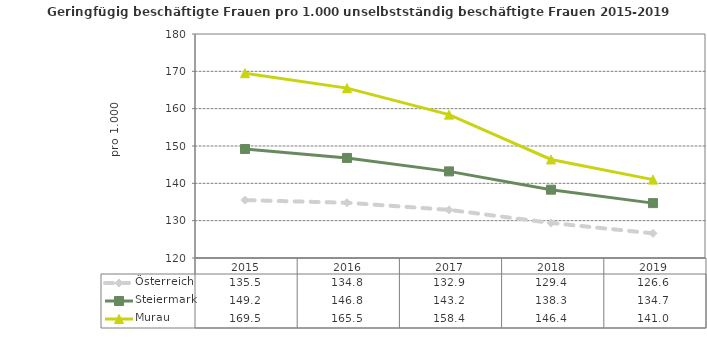
| Category | Österreich | Steiermark | Murau |
|---|---|---|---|
| 2019.0 | 126.6 | 134.7 | 141 |
| 2018.0 | 129.4 | 138.3 | 146.4 |
| 2017.0 | 132.9 | 143.2 | 158.4 |
| 2016.0 | 134.8 | 146.8 | 165.5 |
| 2015.0 | 135.5 | 149.2 | 169.5 |